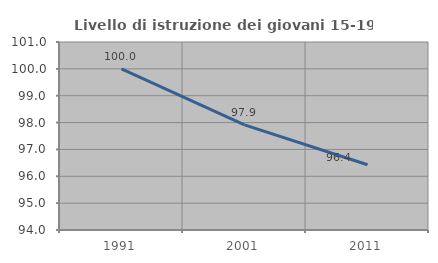
| Category | Livello di istruzione dei giovani 15-19 anni |
|---|---|
| 1991.0 | 100 |
| 2001.0 | 97.917 |
| 2011.0 | 96.429 |